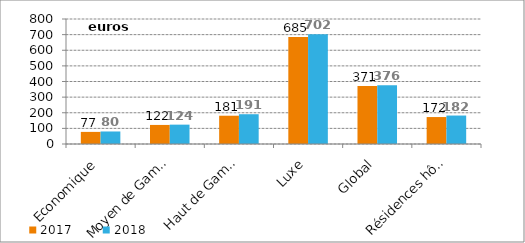
| Category | 2017 | 2018 |
|---|---|---|
| Economique | 77.466 | 80.128 |
| Moyen de Gamme | 122.011 | 123.901 |
| Haut de Gamme | 180.96 | 190.603 |
| Luxe | 684.783 | 701.961 |
| Global | 370.855 | 376.442 |
| Résidences hôtelières | 172.486 | 182.145 |